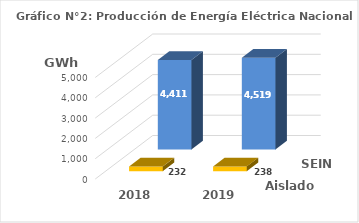
| Category | Aislados | SEIN |
|---|---|---|
| 2018.0 | 231.806 | 4411.174 |
| 2019.0 | 238.268 | 4519.499 |